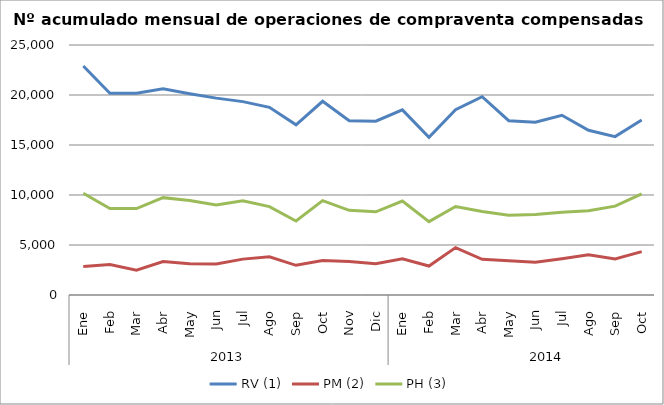
| Category | RV (1) | PM (2) | PH (3) |
|---|---|---|---|
| 0 | 22894 | 2853 | 10176 |
| 1 | 20174 | 3047 | 8641 |
| 2 | 20169 | 2472 | 8638 |
| 3 | 20616 | 3350 | 9736 |
| 4 | 20126 | 3117 | 9441 |
| 5 | 19686 | 3099 | 9000 |
| 6 | 19337 | 3588 | 9415 |
| 7 | 18769 | 3829 | 8838 |
| 8 | 17015 | 2969 | 7402 |
| 9 | 19371 | 3453 | 9435 |
| 10 | 17427 | 3359 | 8465 |
| 11 | 17377 | 3135 | 8315 |
| 12 | 18515 | 3629 | 9396 |
| 13 | 15776 | 2899 | 7337 |
| 14 | 18527 | 4739 | 8846 |
| 15 | 19824 | 3575 | 8345 |
| 16 | 17431 | 3429 | 7965 |
| 17 | 17272 | 3273 | 8041 |
| 18 | 17970 | 3623 | 8279 |
| 19 | 16473 | 4014 | 8423 |
| 20 | 15837 | 3610 | 8889 |
| 21 | 17491 | 4335 | 10117 |